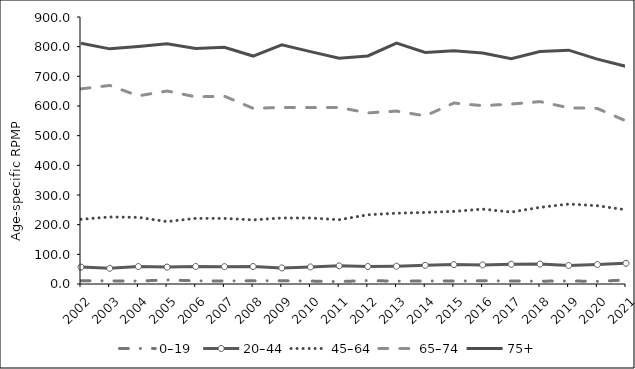
| Category | 0–19  | 20–44 | 45–64 | 65–74 | 75+ |
|---|---|---|---|---|---|
| 2002 | 11.1 | 56.9 | 218.1 | 657.7 | 811.8 |
| 2003 | 10.5 | 53 | 225.8 | 669.3 | 792.6 |
| 2004 | 9.8 | 58.8 | 224.6 | 634.2 | 800.7 |
| 2005 | 13.8 | 57.1 | 210.4 | 650.5 | 809.6 |
| 2006 | 10.6 | 59 | 221.3 | 630.9 | 794.1 |
| 2007 | 10.1 | 58.5 | 221.1 | 633.1 | 798.2 |
| 2008 | 10.8 | 58.9 | 216.1 | 592.1 | 768.4 |
| 2009 | 10.9 | 54.2 | 222.5 | 595.3 | 806.3 |
| 2010 | 9.9 | 57.5 | 222.5 | 594.5 | 783.4 |
| 2011 | 8.1 | 61.2 | 216.7 | 595.2 | 761 |
| 2012 | 11.7 | 58.9 | 233.2 | 576.6 | 768.7 |
| 2013 | 9.6 | 59.9 | 238.6 | 582.8 | 811.7 |
| 2014 | 10.4 | 62.8 | 241.1 | 566.7 | 780.5 |
| 2015 | 10 | 65.4 | 244.8 | 610 | 786.5 |
| 2016 | 10.8 | 64.4 | 252.4 | 601.1 | 778.9 |
| 2017 | 10.2 | 66.6 | 242.5 | 606.6 | 759.4 |
| 2018 | 9.5 | 67.2 | 258.3 | 614.8 | 783.6 |
| 2019 | 10.2 | 62.6 | 269.5 | 594.1 | 788.3 |
| 2020 | 9 | 65.7 | 263.9 | 591.8 | 757.9 |
| 2021 | 13.6 | 69.8 | 250.1 | 549.5 | 733.7 |